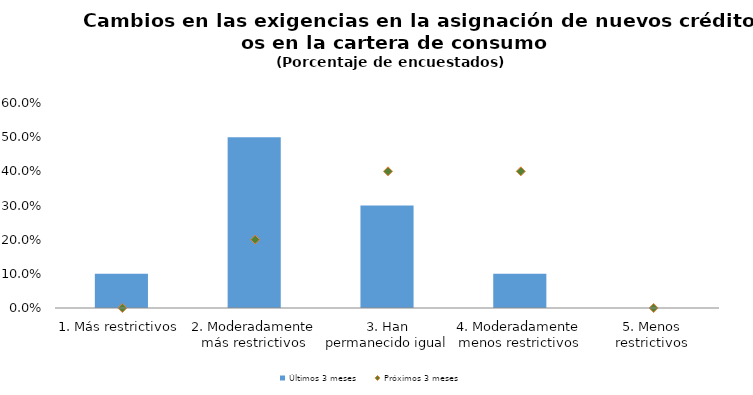
| Category | Últimos 3 meses |
|---|---|
| 1. Más restrictivos | 0.1 |
| 2. Moderadamente más restrictivos | 0.5 |
| 3. Han permanecido igual | 0.3 |
| 4. Moderadamente menos restrictivos | 0.1 |
| 5. Menos restrictivos | 0 |